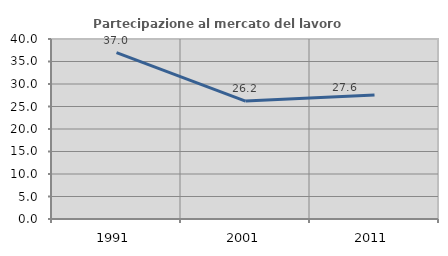
| Category | Partecipazione al mercato del lavoro  femminile |
|---|---|
| 1991.0 | 36.961 |
| 2001.0 | 26.201 |
| 2011.0 | 27.566 |